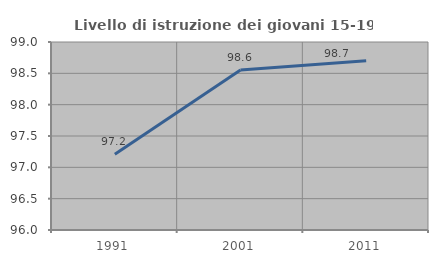
| Category | Livello di istruzione dei giovani 15-19 anni |
|---|---|
| 1991.0 | 97.207 |
| 2001.0 | 98.553 |
| 2011.0 | 98.701 |